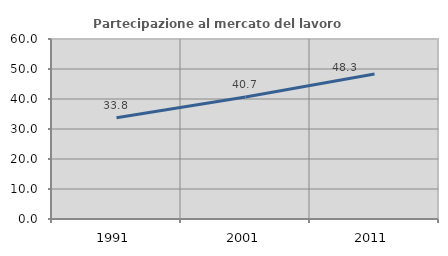
| Category | Partecipazione al mercato del lavoro  femminile |
|---|---|
| 1991.0 | 33.772 |
| 2001.0 | 40.68 |
| 2011.0 | 48.322 |